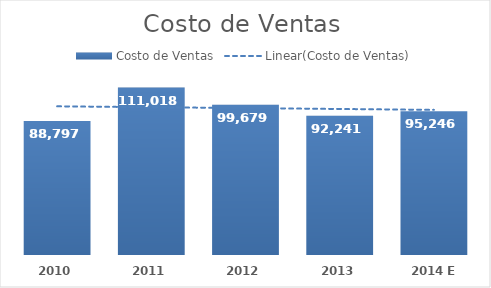
| Category | Costo de Ventas |
|---|---|
| 2010 | 88797.001 |
| 2011 | 111018.454 |
| 2012 | 99678.944 |
| 2013 | 92240.869 |
| 2014 E | 95246.175 |